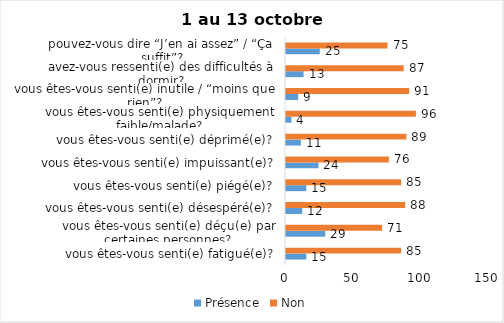
| Category | Présence | Non |
|---|---|---|
| vous êtes-vous senti(e) fatigué(e)? | 15 | 85 |
| vous êtes-vous senti(e) déçu(e) par certaines personnes? | 29 | 71 |
| vous êtes-vous senti(e) désespéré(e)? | 12 | 88 |
| vous êtes-vous senti(e) piégé(e)? | 15 | 85 |
| vous êtes-vous senti(e) impuissant(e)? | 24 | 76 |
| vous êtes-vous senti(e) déprimé(e)? | 11 | 89 |
| vous êtes-vous senti(e) physiquement faible/malade? | 4 | 96 |
| vous êtes-vous senti(e) inutile / “moins que rien”? | 9 | 91 |
| avez-vous ressenti(e) des difficultés à dormir? | 13 | 87 |
| pouvez-vous dire “J’en ai assez” / “Ça suffit”? | 25 | 75 |